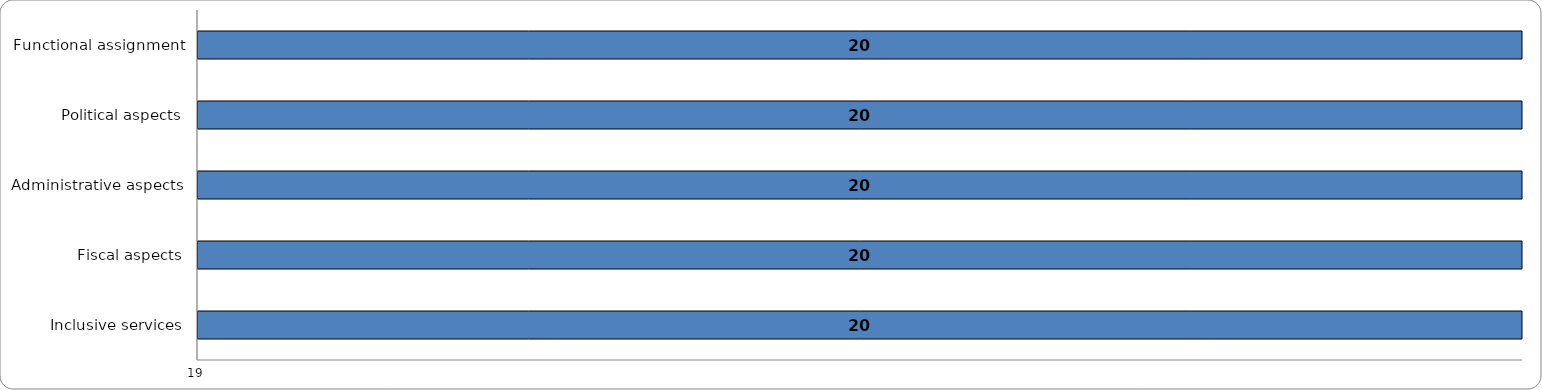
| Category | Series 0 | Series 1 |
|---|---|---|
| Functional assignment | 20 | 0 |
| Political aspects | 20 | 0 |
| Administrative aspects | 20 | 0 |
| Fiscal aspects | 20 | 0 |
| Inclusive services | 20 | 0 |